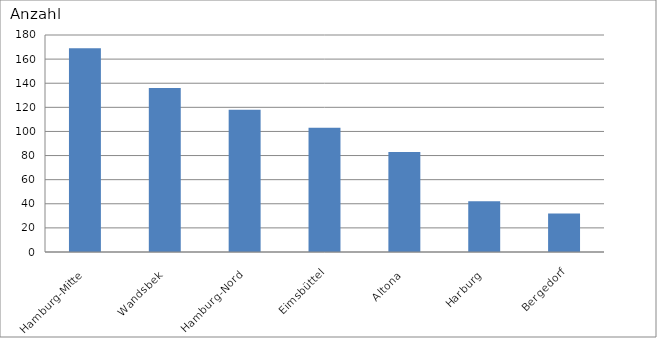
| Category | Hamburg-Mitte Wandsbek Hamburg-Nord Eimsbüttel Altona Harburg Bergedorf |
|---|---|
| Hamburg-Mitte | 169 |
| Wandsbek | 136 |
| Hamburg-Nord | 118 |
| Eimsbüttel | 103 |
| Altona | 83 |
| Harburg | 42 |
| Bergedorf | 32 |